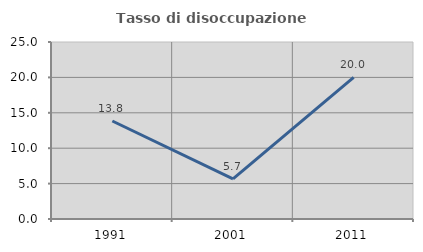
| Category | Tasso di disoccupazione giovanile  |
|---|---|
| 1991.0 | 13.839 |
| 2001.0 | 5.674 |
| 2011.0 | 20 |